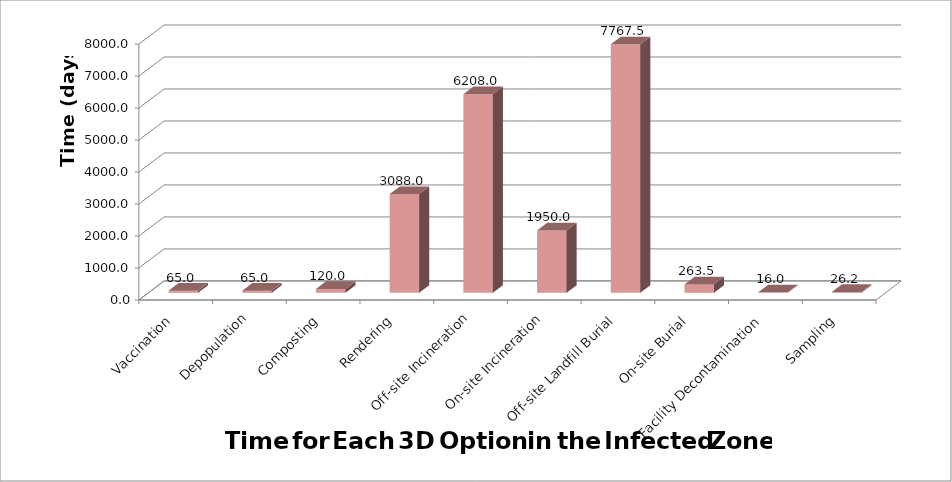
| Category | Series 0 |
|---|---|
| Vaccination | 65 |
| Depopulation | 65 |
| Composting | 120 |
| Rendering | 3088.014 |
| Off-site Incineration | 6208.014 |
| On-site Incineration | 1950 |
| Off-site Landfill Burial | 7767.5 |
| On-site Burial | 263.514 |
| Facility Decontamination | 16 |
| Sampling | 26.194 |